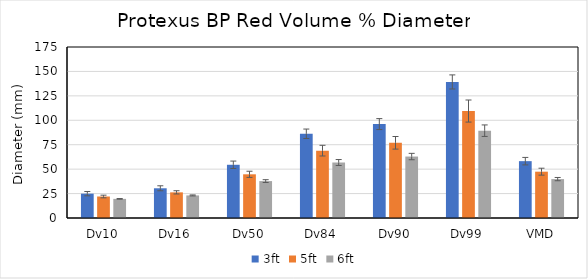
| Category | 3ft | 5ft | 6ft |
|---|---|---|---|
| Dv10 | 24.906 | 22.004 | 19.584 |
| Dv16 | 30.414 | 26.258 | 23.098 |
| Dv50 | 54.47 | 44.714 | 37.776 |
| Dv84 | 86.206 | 68.928 | 56.798 |
| Dv90 | 96.102 | 76.958 | 62.888 |
| Dv99 | 139.236 | 109.458 | 89.362 |
| VMD | 58.178 | 47.402 | 39.806 |